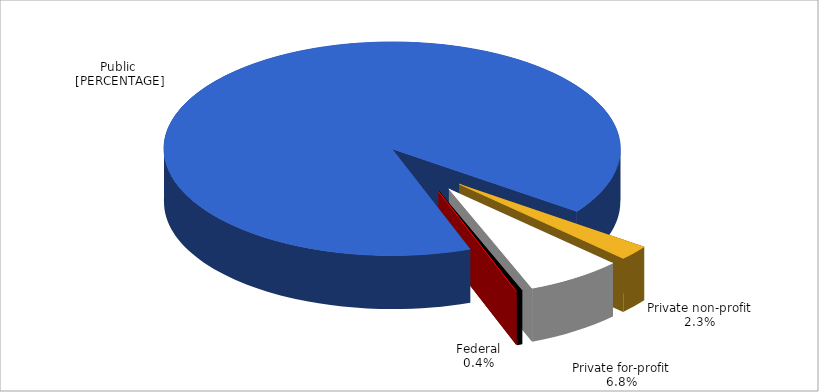
| Category | Series 0 |
|---|---|
| Public | 0.905 |
| Private non-profit | 0.023 |
| Private for-profit | 0.068 |
| Federal | 0.004 |